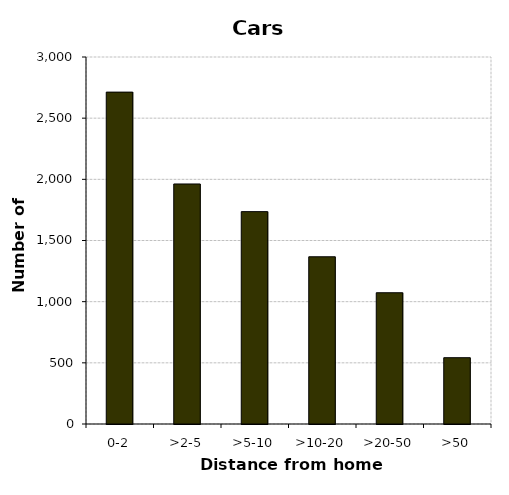
| Category | Cars |
|---|---|
| 0-2 | 2713 |
| >2-5 | 1962 |
| >5-10 | 1736 |
| >10-20 | 1367 |
| >20-50 | 1073 |
| >50 | 542 |